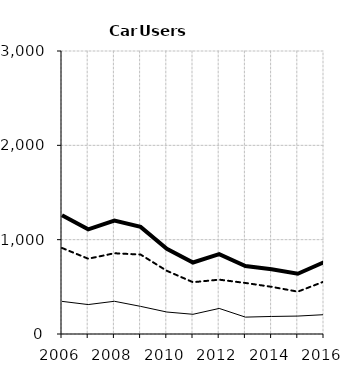
| Category | Built-up | Non built-up | Total |
|---|---|---|---|
| 2006.0 | 346 | 912 | 1258 |
| 2007.0 | 312 | 798 | 1110 |
| 2008.0 | 347 | 856 | 1203 |
| 2009.0 | 293 | 842 | 1135 |
| 2010.0 | 233 | 670 | 903 |
| 2011.0 | 209 | 549 | 758 |
| 2012.0 | 271 | 576 | 847 |
| 2013.0 | 179 | 541 | 720 |
| 2014.0 | 186 | 500 | 686 |
| 2015.0 | 190 | 449 | 639 |
| 2016.0 | 205 | 556 | 761 |